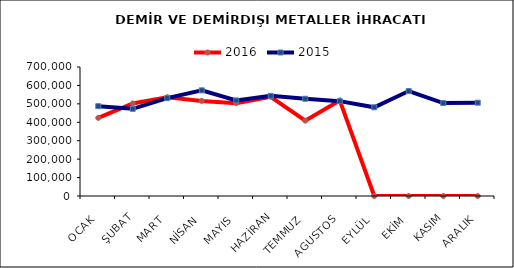
| Category | 2016 | 2015 |
|---|---|---|
| OCAK | 423834.378 | 487406.649 |
| ŞUBAT | 502354.201 | 472955.404 |
| MART | 536393.847 | 531382.433 |
| NİSAN | 515843.101 | 573363.506 |
| MAYIS | 503601.765 | 518542.473 |
| HAZİRAN | 538557.098 | 543286.542 |
| TEMMUZ | 408943.326 | 527477.474 |
| AGUSTOS | 518675.147 | 514661.396 |
| EYLÜL | 0 | 481265.499 |
| EKİM | 0 | 569425.178 |
| KASIM | 0 | 504228.785 |
| ARALIK | 0 | 506304.492 |